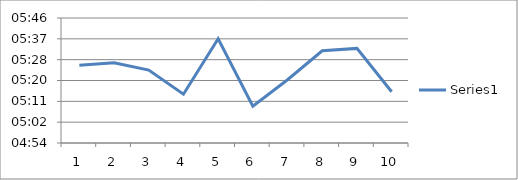
| Category | Series 0 |
|---|---|
| 0 | 0.004 |
| 1 | 0.004 |
| 2 | 0.004 |
| 3 | 0.004 |
| 4 | 0.004 |
| 5 | 0.004 |
| 6 | 0.004 |
| 7 | 0.004 |
| 8 | 0.004 |
| 9 | 0.004 |